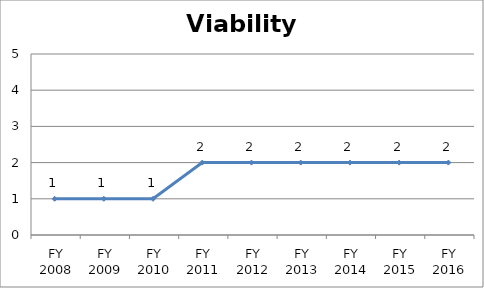
| Category | Viability score |
|---|---|
| FY 2016 | 2 |
| FY 2015 | 2 |
| FY 2014 | 2 |
| FY 2013 | 2 |
| FY 2012 | 2 |
| FY 2011 | 2 |
| FY 2010 | 1 |
| FY 2009 | 1 |
| FY 2008 | 1 |